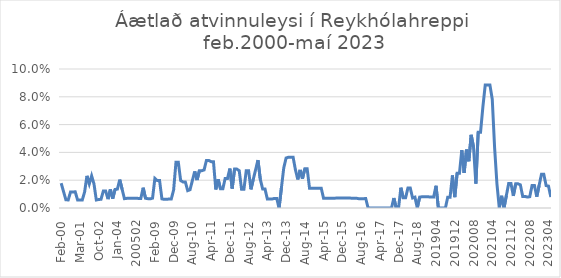
| Category | Áætlað atvinnuleysi |
|---|---|
| feb.00 | 0.018 |
| apr.00 | 0.012 |
| maí.00 | 0.006 |
| júl.00 | 0.006 |
| ágú.00 | 0.012 |
| sep.00 | 0.012 |
| jan.01 | 0.012 |
| feb.01 | 0.006 |
| mar.01 | 0.006 |
| nóv.01 | 0.006 |
| des.01 | 0.011 |
| jan.02 | 0.023 |
| feb.02 | 0.017 |
| mar.02 | 0.023 |
| apr.02 | 0.017 |
| maí.02 | 0.006 |
| okt.02 | 0.006 |
| mar.03 | 0.006 |
| apr.03 | 0.012 |
| maí.03 | 0.012 |
| sep.03 | 0.006 |
| okt.03 | 0.013 |
| nóv.03 | 0.007 |
| des.03 | 0.013 |
| jan.04 | 0.014 |
| feb.04 | 0.02 |
| mar.04 | 0.014 |
| apr.04 | 0.007 |
| júl.04 | 0.007 |
| ágú.04 | 0.007 |
| okt.04 | 0.007 |
| 200501 | 0.007 |
| 200502 | 0.007 |
| apr.05 | 0.007 |
| jún.05 | 0.007 |
| júl.05 | 0.015 |
| ágú.06 | 0.007 |
| júl.07 | 0.007 |
| jún.08 | 0.007 |
| jan.09 | 0.007 |
| feb.09 | 0.021 |
| apr.09 | 0.02 |
| maí.09 | 0.02 |
| jún.09 | 0.007 |
| júl.09 | 0.006 |
| ágú.09 | 0.006 |
| okt.09 | 0.006 |
| nóv.09 | 0.006 |
| des.09 | 0.013 |
| jan.10 | 0.033 |
| feb.10 | 0.033 |
| mar.10 | 0.02 |
| apr.10 | 0.019 |
| maí.10 | 0.019 |
| jún.10 | 0.012 |
| júl.10 | 0.013 |
| ágú.10 | 0.02 |
| sep.10 | 0.026 |
| okt.10 | 0.02 |
| nóv.10 | 0.027 |
| des.10 | 0.027 |
| jan.11 | 0.027 |
| feb.11 | 0.034 |
| mar.11 | 0.034 |
| apr.11 | 0.033 |
| maí.11 | 0.033 |
| jún.11 | 0.013 |
| júl.11 | 0.021 |
| ágú.11 | 0.014 |
| sep.11 | 0.014 |
| okt.11 | 0.021 |
| nóv.11 | 0.021 |
| des.11 | 0.028 |
| jan.12 | 0.014 |
| feb.12 | 0.028 |
| mar.12 | 0.028 |
| apr.12 | 0.027 |
| maí.12 | 0.013 |
| jún.12 | 0.013 |
| júl.12 | 0.027 |
| ágú.12 | 0.027 |
| sep.12 | 0.013 |
| okt.12 | 0.021 |
| nóv.12 | 0.028 |
| des.12 | 0.034 |
| jan.13 | 0.021 |
| feb.13 | 0.014 |
| mar.13 | 0.014 |
| apr.13 | 0.006 |
| maí.13 | 0.006 |
| jún.13 | 0.006 |
| júl.13 | 0.007 |
| ágú.13 | 0.007 |
| sep.13 | 0 |
| okt.13 | 0.014 |
| nóv.13 | 0.029 |
| des.13 | 0.036 |
| jan.14 | 0.036 |
| feb.14 | 0.036 |
| mar.14 | 0.036 |
| apr.14 | 0.027 |
| maí.14 | 0.021 |
| jún.14 | 0.027 |
| júl.14 | 0.021 |
| ágú.14 | 0.028 |
| sep.14 | 0.028 |
| okt.14 | 0.014 |
| nóv.14 | 0.014 |
| des.14 | 0.014 |
| jan.15 | 0.014 |
| feb.15 | 0.014 |
| mar.15 | 0.014 |
| apr.15 | 0.007 |
| maí.15 | 0.007 |
| jún.15 | 0.007 |
| júl.15 | 0.007 |
| ágú.15 | 0.007 |
| sep.15 | 0.007 |
| okt.15 | 0.007 |
| nóv.15 | 0.007 |
| des.15 | 0.007 |
| jan.16 | 0.007 |
| feb.16 | 0.007 |
| mar.16 | 0.007 |
| apr.16 | 0.007 |
| maí.16 | 0.007 |
| jún.16 | 0.007 |
| júl.16 | 0.007 |
| ágú.16 | 0.007 |
| sep.16 | 0.007 |
| okt.16 | 0.007 |
| nóv.16 | 0 |
| des.16 | 0 |
| jan.17 | 0 |
| feb.17 | 0 |
| mar.17 | 0 |
| apr.17 | 0 |
| maí.17 | 0 |
| jún.17 | 0 |
| júl.17 | 0 |
| ágú.17 | 0 |
| sep.17 | 0 |
| okt.17 | 0.007 |
| nóv.17 | 0 |
| des.17 | 0 |
| jan.18 | 0.015 |
| feb.18 | 0.007 |
| mar.18 | 0.007 |
| apr.18 | 0.014 |
| maí.18 | 0.014 |
| jún.18 | 0.007 |
| júl.18 | 0.008 |
| ágú.18 | 0 |
| 201809 | 0.008 |
| 201810 | 0.008 |
| 201811 | 0.008 |
| 201812 | 0.008 |
| 201901 | 0.008 |
| 201902 | 0.008 |
| 201903 | 0.008 |
| 201904 | 0.016 |
| 201905 | 0 |
| 201906 | 0 |
| 201907 | 0 |
| 201908 | 0 |
| 201909 | 0.008 |
| 201910 | 0.008 |
| 201911 | 0.023 |
| 201912 | 0.008 |
| 202001 | 0.025 |
| 202002 | 0.025 |
| 202003 | 0.042 |
| 202004 | 0.025 |
| 202005 | 0.042 |
| 202006 | 0.034 |
| 202007 | 0.053 |
| 202008 | 0.044 |
| 202009 | 0.018 |
| 202010 | 0.055 |
| 202011 | 0.055 |
| 202012 | 0.073 |
| 202101 | 0.088 |
| 202102 | 0.088 |
| 202103 | 0.088 |
| 202104 | 0.078 |
| 202105 | 0.043 |
| 202106 | 0.017 |
| 202107 | 0 |
| 202108 | 0.009 |
| 202109 | 0 |
| 202110 | 0.009 |
| 202111 | 0.018 |
| 202112 | 0.018 |
| 202201 | 0.009 |
| 202202 | 0.017 |
| 202203 | 0.017 |
| 202204 | 0.017 |
| 202205 | 0.008 |
| 202206 | 0.008 |
| 202207 | 0.008 |
| 202208 | 0.008 |
| 202209 | 0.016 |
| 202210 | 0.016 |
| 202211 | 0.008 |
| 202212 | 0.016 |
| 202301 | 0.024 |
| 202302 | 0.024 |
| 202303 | 0.016 |
| 202304 | 0.016 |
| 202305 | 0.008 |